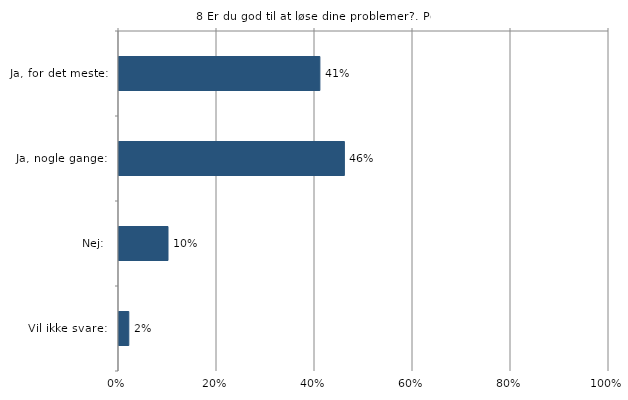
| Category | Er du god til at løse dine problemer? |
|---|---|
| Ja, for det meste:  | 0.41 |
| Ja, nogle gange:  | 0.46 |
| Nej:  | 0.1 |
| Vil ikke svare:  | 0.02 |